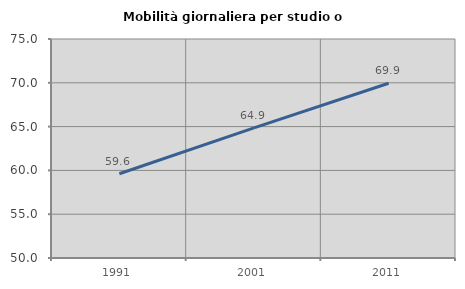
| Category | Mobilità giornaliera per studio o lavoro |
|---|---|
| 1991.0 | 59.614 |
| 2001.0 | 64.86 |
| 2011.0 | 69.95 |